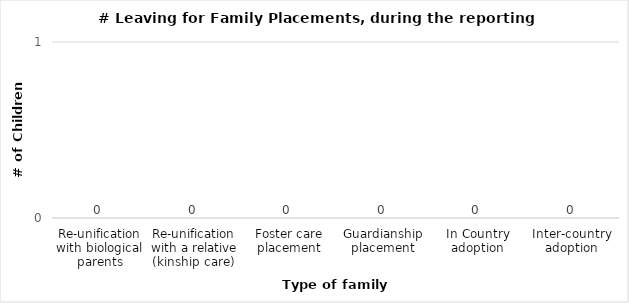
| Category | # |
|---|---|
| Re-unification with biological parents | 0 |
| Re-unification with a relative (kinship care) | 0 |
| Foster care placement | 0 |
| Guardianship placement | 0 |
| In Country adoption | 0 |
| Inter-country adoption | 0 |